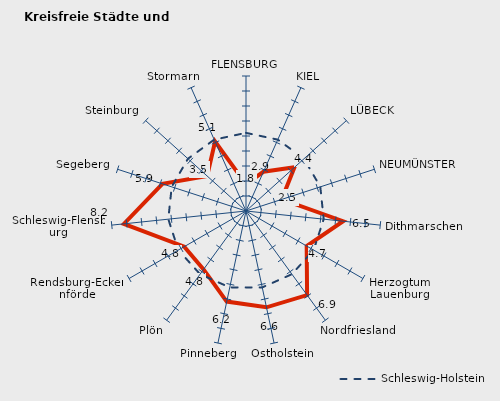
| Category | Kreise | Schleswig-Holstein |
|---|---|---|
| FLENSBURG | 1.789 | 5.208 |
| KIEL | 2.863 | 5.208 |
| LÜBECK | 4.351 | 5.208 |
| NEUMÜNSTER | 2.503 | 5.208 |
| Dithmarschen | 6.509 | 5.208 |
| Herzogtum Lauenburg | 4.671 | 5.208 |
| Nordfriesland | 6.929 | 5.208 |
| Ostholstein | 6.564 | 5.208 |
| Pinneberg | 6.173 | 5.208 |
| Plön | 4.812 | 5.208 |
| Rendsburg-Eckernförde | 4.756 | 5.208 |
| Schleswig-Flensburg | 8.185 | 5.208 |
| Segeberg | 5.859 | 5.208 |
| Steinburg | 3.485 | 5.208 |
| Stormarn | 5.069 | 5.208 |